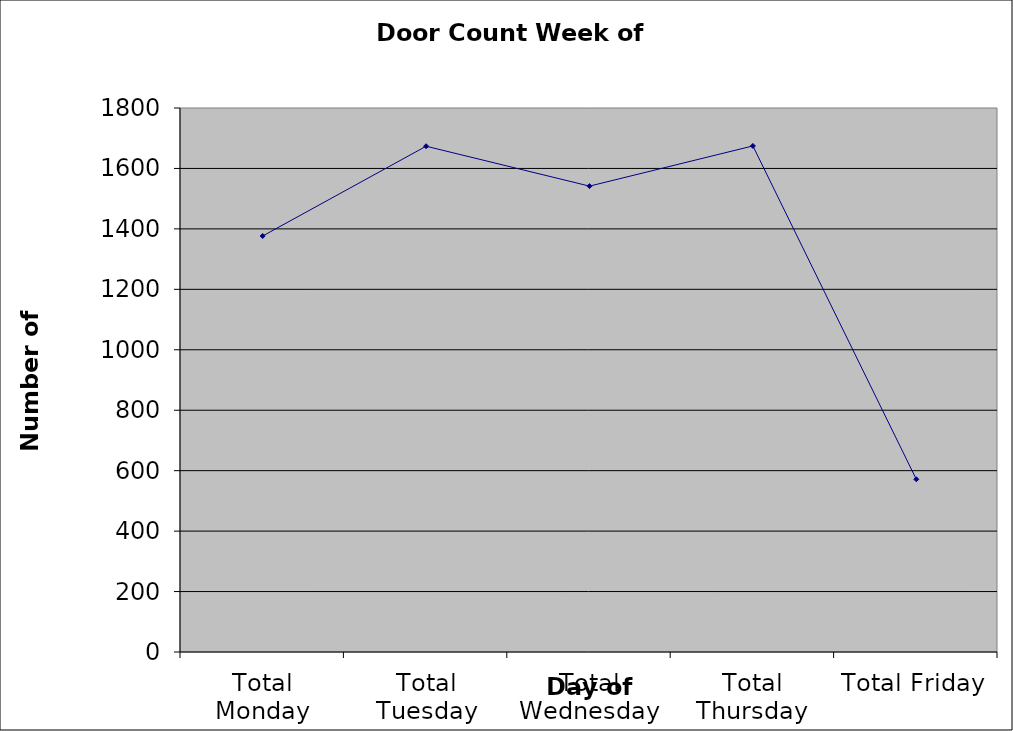
| Category | Series 0 |
|---|---|
| Total Monday | 1376.5 |
| Total Tuesday | 1673.5 |
| Total Wednesday | 1541.5 |
| Total Thursday | 1674.5 |
| Total Friday | 571.5 |